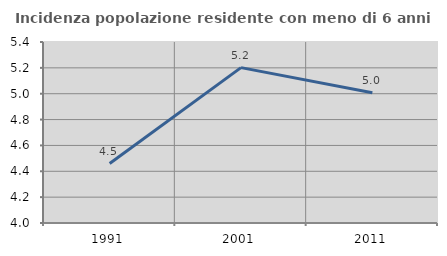
| Category | Incidenza popolazione residente con meno di 6 anni |
|---|---|
| 1991.0 | 4.46 |
| 2001.0 | 5.202 |
| 2011.0 | 5.007 |